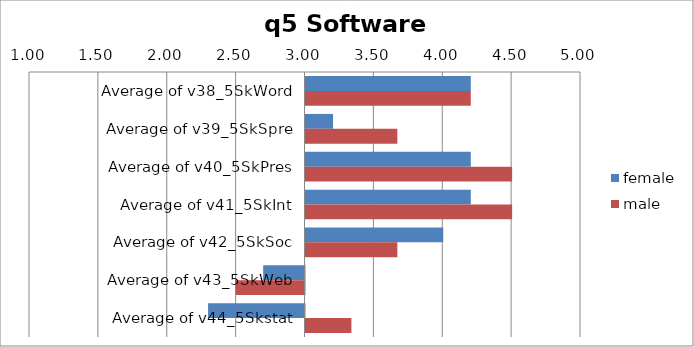
| Category | female | male |
|---|---|---|
| Average of v38_5SkWord | 4.2 | 4.2 |
| Average of v39_5SkSpre | 3.2 | 3.667 |
| Average of v40_5SkPres | 4.2 | 4.5 |
| Average of v41_5SkInt | 4.2 | 4.5 |
| Average of v42_5SkSoc | 4 | 3.667 |
| Average of v43_5SkWeb | 2.7 | 2.5 |
| Average of v44_5Skstat | 2.3 | 3.333 |